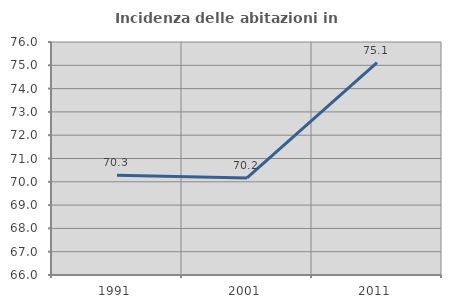
| Category | Incidenza delle abitazioni in proprietà  |
|---|---|
| 1991.0 | 70.281 |
| 2001.0 | 70.168 |
| 2011.0 | 75.12 |